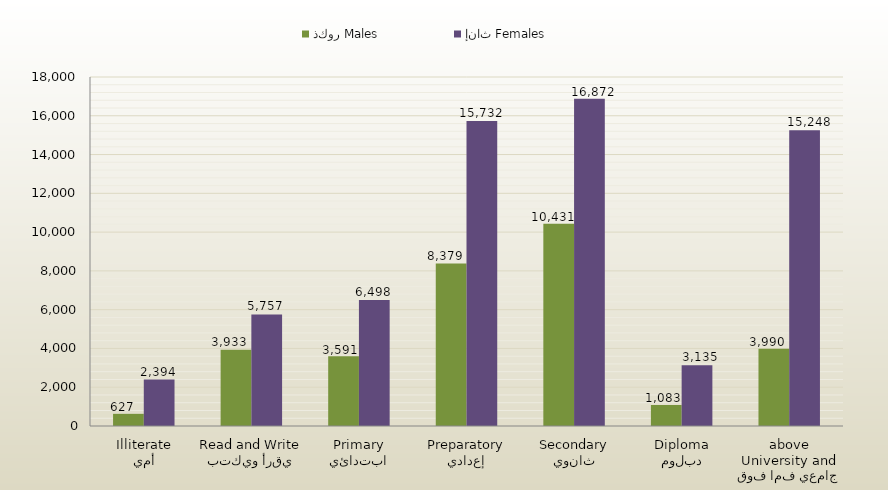
| Category | ذكور Males | إناث Females |
|---|---|---|
| أمي
Illiterate | 627 | 2394 |
| يقرأ ويكتب
Read and Write | 3933 | 5757 |
| ابتدائي
Primary | 3591 | 6498 |
| إعدادي
Preparatory | 8379 | 15732 |
| ثانوي
Secondary | 10431 | 16872 |
| دبلوم
Diploma | 1083 | 3135 |
| جامعي فما فوق
University and above | 3990 | 15248 |